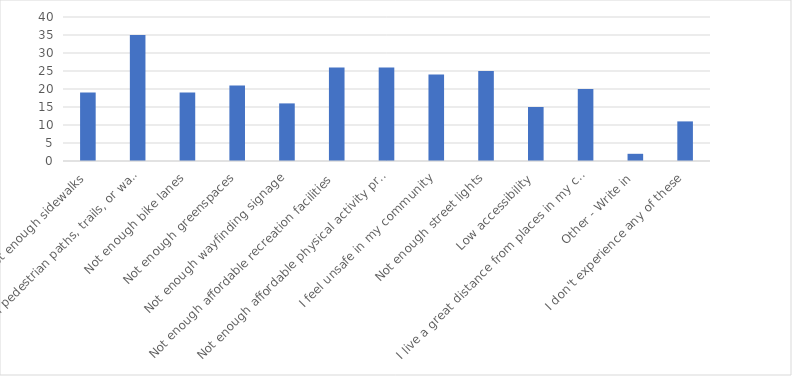
| Category | Number of Responses |
|---|---|
| Not enough sidewalks | 19 |
| Not enough pedestrian paths, trails, or walkways | 35 |
| Not enough bike lanes | 19 |
| Not enough greenspaces | 21 |
| Not enough wayfinding signage | 16 |
| Not enough affordable recreation facilities | 26 |
| Not enough affordable physical activity programs | 26 |
| I feel unsafe in my community | 24 |
| Not enough street lights | 25 |
| Low accessibility | 15 |
| I live a great distance from places in my community | 20 |
| Other - Write in | 2 |
| I don't experience any of these | 11 |